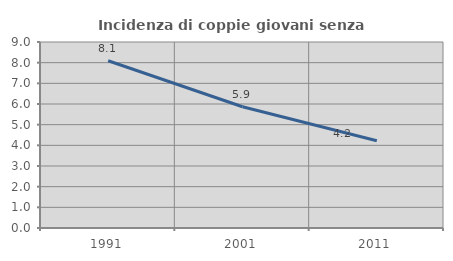
| Category | Incidenza di coppie giovani senza figli |
|---|---|
| 1991.0 | 8.094 |
| 2001.0 | 5.869 |
| 2011.0 | 4.224 |